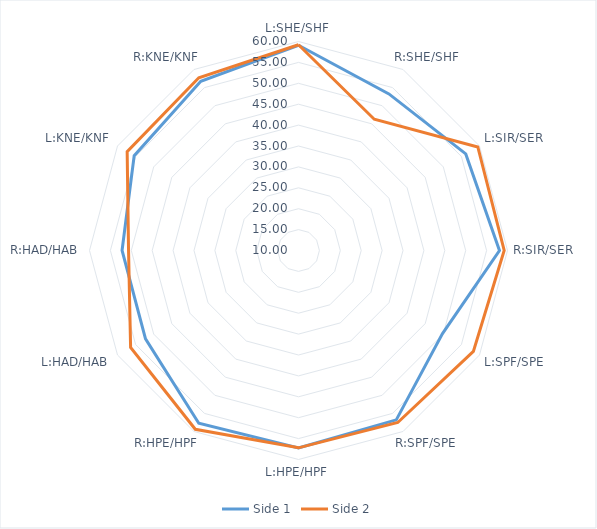
| Category | Side 1 | Side 2 |
|---|---|---|
| L:SHE/SHF | 59.11 | 59.23 |
| R:SHE/SHF | 53.26 | 46.25 |
| L:SIR/SER | 56.2 | 59.53 |
| R:SIR/SER | 58.08 | 59.21 |
| L:SPF/SPE | 49.78 | 58.31 |
| R:SPF/SPE | 56.78 | 57.51 |
| L:HPE/HPF | 57.26 | 57.21 |
| R:HPE/HPF | 57.71 | 59.38 |
| L:HAD/HAB | 52.26 | 56.38 |
| R:HAD/HAB | 52.21 | 50.66 |
| L:KNE/KNF | 55.39 | 57.33 |
| R:KNE/KNF | 56.75 | 57.7 |